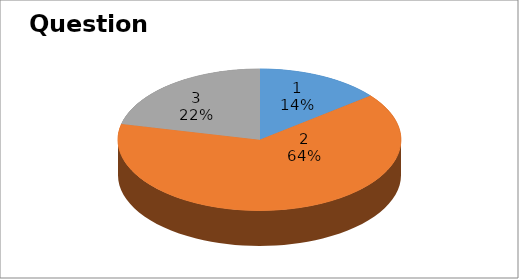
| Category | Series 0 |
|---|---|
| 0 | 2 |
| 1 | 9 |
| 2 | 3 |